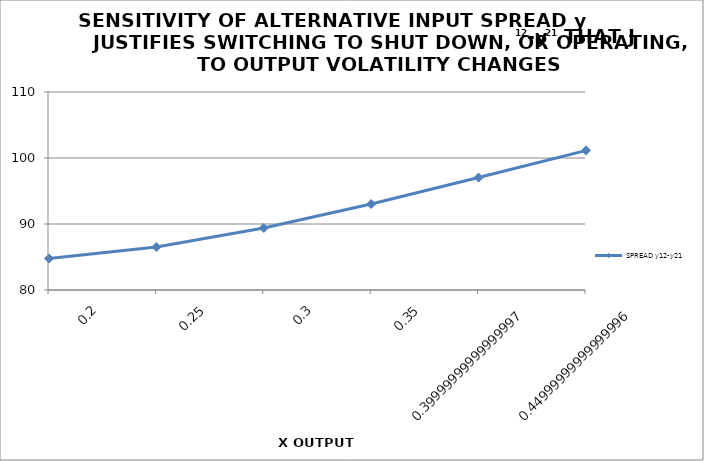
| Category | SPREAD y12-y21 |
|---|---|
| 0.2 | 84.772 |
| 0.25 | 86.512 |
| 0.3 | 89.401 |
| 0.35 | 93.029 |
| 0.39999999999999997 | 97.036 |
| 0.44999999999999996 | 101.145 |